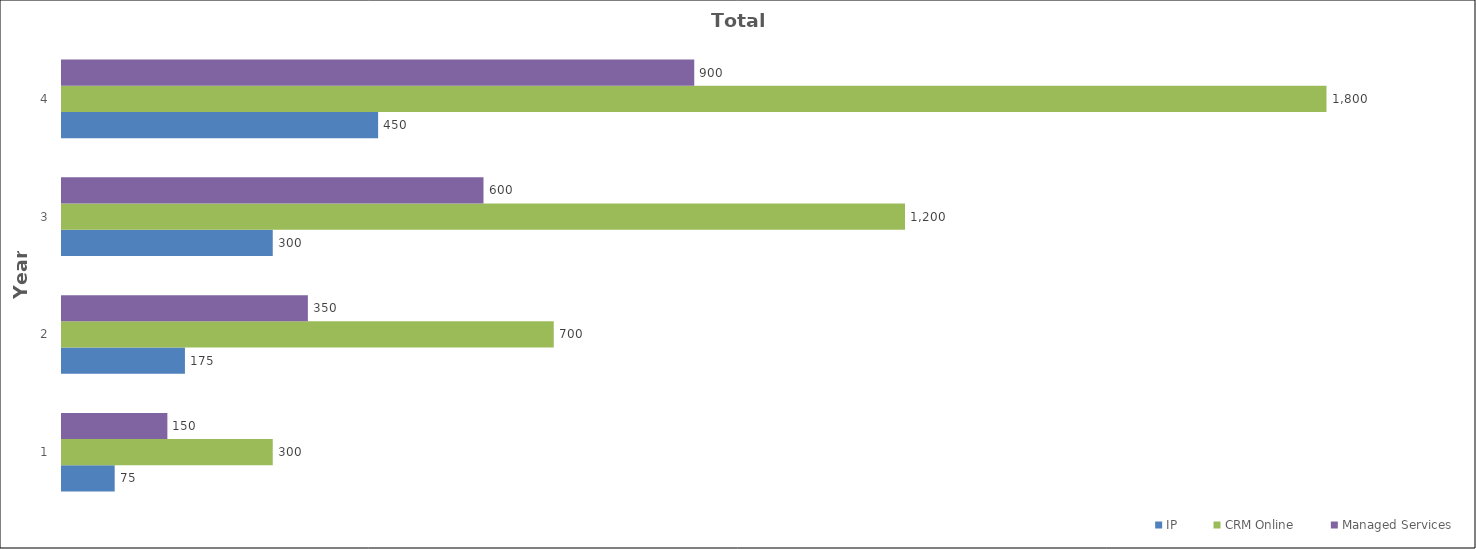
| Category | IP | CRM Online | Managed Services |
|---|---|---|---|
| 1.0 | 75 | 300 | 150 |
| 2.0 | 175 | 700 | 350 |
| 3.0 | 300 | 1200 | 600 |
| 4.0 | 450 | 1800 | 900 |